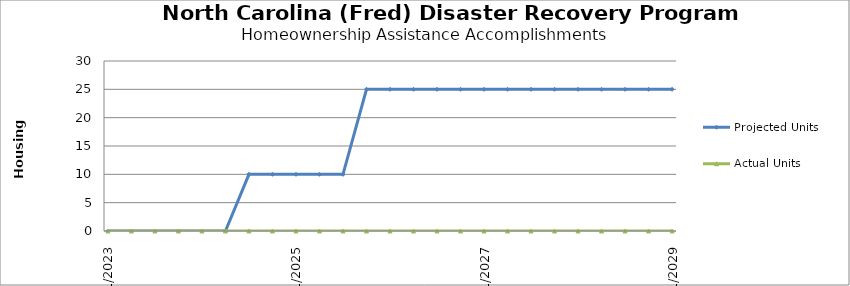
| Category | Projected Units | Actual Units |
|---|---|---|
| 4/1/23 | 0 | 0 |
| 7/1/23 | 0 | 0 |
| 10/1/23 | 0 | 0 |
| 1/1/24 | 0 | 0 |
| 4/1/24 | 0 | 0 |
| 7/1/24 | 0 | 0 |
| 10/1/24 | 10 | 0 |
| 1/1/25 | 10 | 0 |
| 4/1/25 | 10 | 0 |
| 7/1/25 | 10 | 0 |
| 10/1/25 | 10 | 0 |
| 1/1/26 | 25 | 0 |
| 4/1/26 | 25 | 0 |
| 7/1/26 | 25 | 0 |
| 10/1/26 | 25 | 0 |
| 1/1/27 | 25 | 0 |
| 4/1/27 | 25 | 0 |
| 7/1/27 | 25 | 0 |
| 10/1/27 | 25 | 0 |
| 1/1/28 | 25 | 0 |
| 4/1/28 | 25 | 0 |
| 7/1/28 | 25 | 0 |
| 10/1/28 | 25 | 0 |
| 1/1/29 | 25 | 0 |
| 4/1/29 | 25 | 0 |